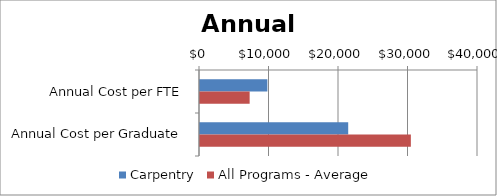
| Category | Carpentry | All Programs - Average |
|---|---|---|
| Annual Cost per FTE | 9692.794 | 7144 |
| Annual Cost per Graduate | 21324.148 | 30340 |